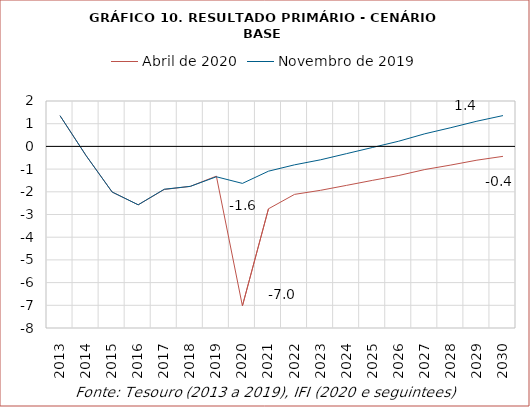
| Category | Abril de 2020 | Novembro de 2019 |
|---|---|---|
| 2013.0 | 1.353 | 1.353 |
| 2014.0 | -0.406 | -0.406 |
| 2015.0 | -2.01 | -2.01 |
| 2016.0 | -2.573 | -2.572 |
| 2017.0 | -1.896 | -1.888 |
| 2018.0 | -1.761 | -1.761 |
| 2019.0 | -1.31 | -1.338 |
| 2020.0 | -7.028 | -1.63 |
| 2021.0 | -2.749 | -1.091 |
| 2022.0 | -2.114 | -0.812 |
| 2023.0 | -1.934 | -0.59 |
| 2024.0 | -1.716 | -0.318 |
| 2025.0 | -1.494 | -0.045 |
| 2026.0 | -1.283 | 0.229 |
| 2027.0 | -1.02 | 0.556 |
| 2028.0 | -0.821 | 0.825 |
| 2029.0 | -0.606 | 1.111 |
| 2030.0 | -0.439 | 1.357 |